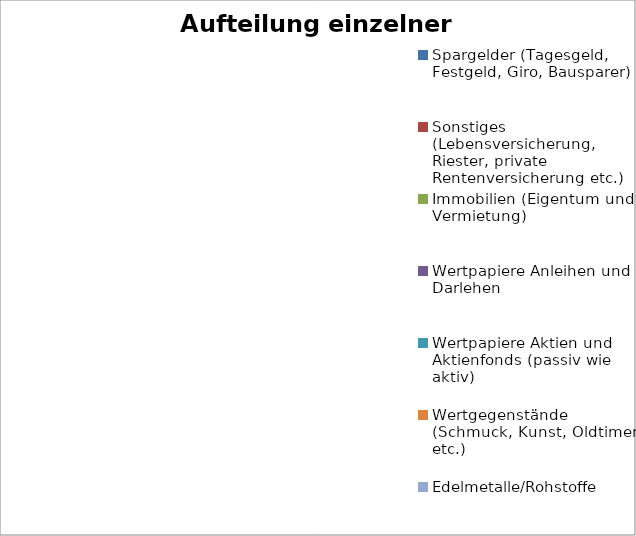
| Category | Series 0 |
|---|---|
| Spargelder (Tagesgeld, Festgeld, Giro, Bausparer) | 0 |
| Sonstiges (Lebensversicherung, Riester, private Rentenversicherung etc.) | 0 |
| Immobilien (Eigentum und Vermietung) | 0 |
| Wertpapiere Anleihen und Darlehen | 0 |
| Wertpapiere Aktien und Aktienfonds (passiv wie aktiv) | 0 |
| Wertgegenstände (Schmuck, Kunst, Oldtimer etc.) | 0 |
| Edelmetalle/Rohstoffe | 0 |